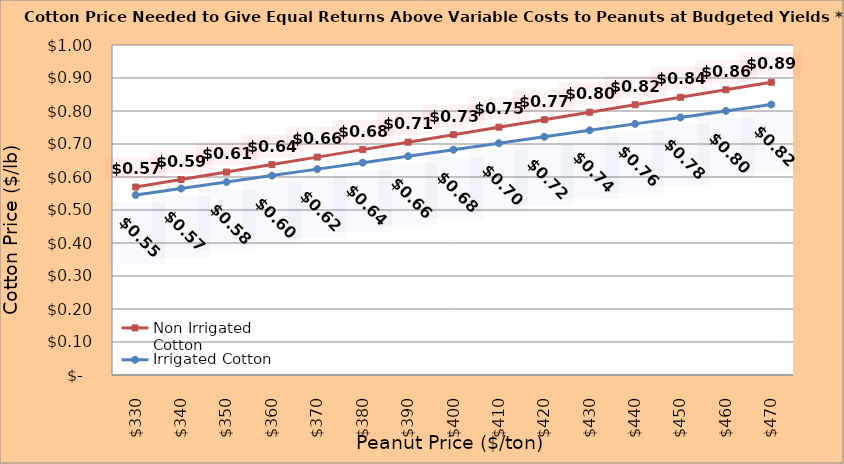
| Category | Non Irrigated Cotton | Irrigated Cotton |
|---|---|---|
| 330.0 | 0.57 | 0.546 |
| 340.0 | 0.592 | 0.565 |
| 350.0 | 0.615 | 0.585 |
| 360.0 | 0.638 | 0.604 |
| 370.0 | 0.66 | 0.624 |
| 380.0 | 0.683 | 0.643 |
| 390.0 | 0.706 | 0.663 |
| 400.0 | 0.728 | 0.683 |
| 410.0 | 0.751 | 0.702 |
| 420.0 | 0.774 | 0.722 |
| 430.0 | 0.796 | 0.741 |
| 440.0 | 0.819 | 0.761 |
| 450.0 | 0.842 | 0.781 |
| 460.0 | 0.864 | 0.8 |
| 470.0 | 0.887 | 0.82 |